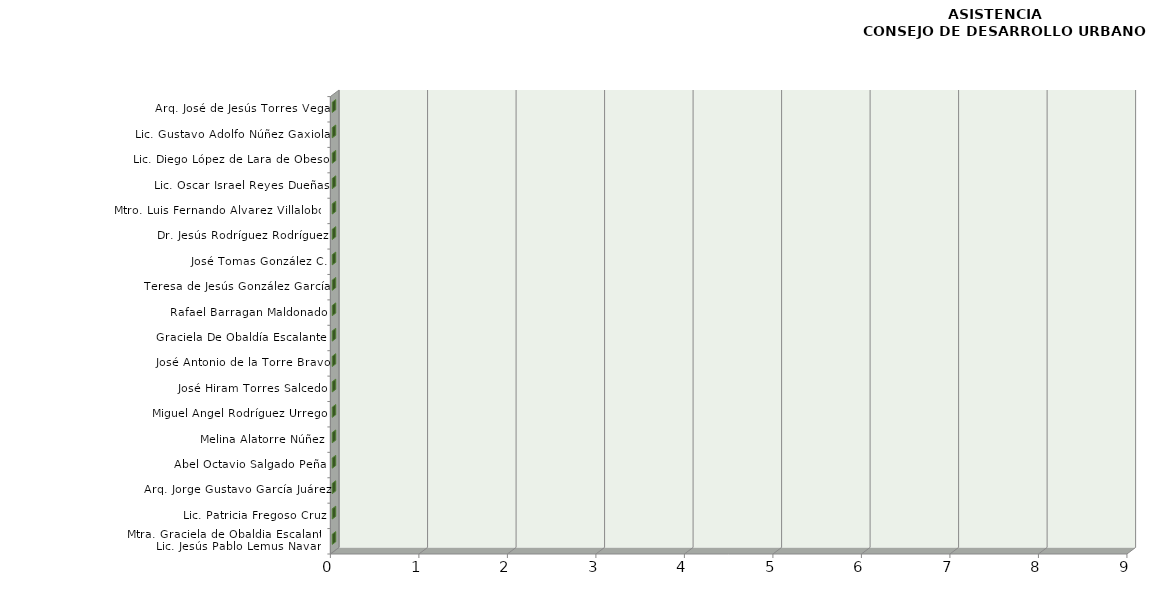
| Category | Series 0 |
|---|---|
| Mtra. Graciela de Obaldia Escalante/
Lic. Jesús Pablo Lemus Navarro | 0 |
| Lic. Patricia Fregoso Cruz | 0 |
| Arq. Jorge Gustavo García Juárez | 0 |
| Abel Octavio Salgado Peña | 0 |
| Melina Alatorre Núñez | 0 |
| Miguel Ángel Rodríguez Urrego | 0 |
| José Hiram Torres Salcedo | 0 |
| José Antonio de la Torre Bravo | 0 |
| Graciela De Obaldía Escalante | 0 |
| Rafael Barragan Maldonado | 0 |
| Teresa de Jesús González García | 0 |
| José Tomas González C. | 0 |
| Dr. Jesús Rodríguez Rodríguez | 0 |
| Mtro. Luis Fernando Álvarez Villalobos | 0 |
| Lic. Oscar Israel Reyes Dueñas | 0 |
| Lic. Diego López de Lara de Obeso | 0 |
| Lic. Gustavo Adolfo Núñez Gaxiola | 0 |
| Arq. José de Jesús Torres Vega | 0 |